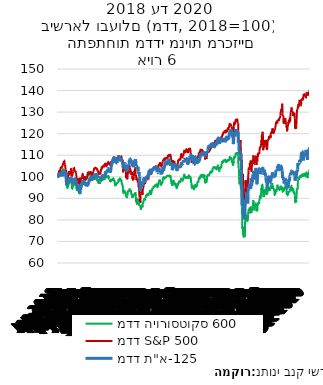
| Category | מדד היורוסטוקס 600  | מדד S&P 500 | מדד ת"א-125 |
|---|---|---|---|
| 2018-01-01 | 100 | 100 | 100 |
| 2018-01-02 | 99.787 | 100.83 | 100.552 |
| 2018-01-03 | 100.267 | 101.476 | 100.318 |
| 2018-01-04 | 101.156 | 101.884 | 101.053 |
| 2018-01-05 | 102.099 | 102.601 | 101.053 |
| 2018-01-06 | 102.099 | 102.601 | 101.053 |
| 2018-01-07 | 102.099 | 102.601 | 101.323 |
| 2018-01-08 | 102.372 | 102.772 | 100.929 |
| 2018-01-09 | 102.808 | 102.905 | 101.043 |
| 2018-01-10 | 102.42 | 102.791 | 100.127 |
| 2018-01-11 | 102.074 | 103.514 | 101.027 |
| 2018-01-12 | 102.392 | 104.213 | 101.027 |
| 2018-01-13 | 102.392 | 104.213 | 101.027 |
| 2018-01-14 | 102.392 | 104.213 | 101.786 |
| 2018-01-15 | 102.223 | 104.213 | 101.519 |
| 2018-01-16 | 102.356 | 103.845 | 101.572 |
| 2018-01-17 | 102.259 | 104.823 | 101.063 |
| 2018-01-18 | 102.454 | 104.654 | 100.897 |
| 2018-01-19 | 103.006 | 105.113 | 100.897 |
| 2018-01-20 | 103.006 | 105.113 | 100.897 |
| 2018-01-21 | 103.006 | 105.113 | 100.708 |
| 2018-01-22 | 103.322 | 105.96 | 101.179 |
| 2018-01-23 | 103.502 | 106.191 | 101.41 |
| 2018-01-24 | 102.983 | 106.131 | 101.652 |
| 2018-01-25 | 102.41 | 106.195 | 101.86 |
| 2018-01-26 | 102.927 | 107.453 | 101.86 |
| 2018-01-27 | 102.927 | 107.453 | 101.86 |
| 2018-01-28 | 102.927 | 107.453 | 102.695 |
| 2018-01-29 | 102.729 | 106.729 | 102.328 |
| 2018-01-30 | 101.783 | 105.566 | 101.649 |
| 2018-01-31 | 101.614 | 105.618 | 102.193 |
| 2018-02-01 | 101.107 | 105.549 | 101.828 |
| 2018-02-02 | 99.715 | 103.311 | 101.828 |
| 2018-02-03 | 99.715 | 103.311 | 101.828 |
| 2018-02-04 | 99.715 | 103.311 | 99.882 |
| 2018-02-05 | 98.155 | 99.077 | 99.173 |
| 2018-02-06 | 95.789 | 100.805 | 97.488 |
| 2018-02-07 | 97.675 | 100.301 | 98.548 |
| 2018-02-08 | 96.107 | 96.536 | 97.358 |
| 2018-02-09 | 94.715 | 97.978 | 97.358 |
| 2018-02-10 | 94.715 | 97.978 | 97.358 |
| 2018-02-11 | 94.715 | 97.978 | 96.201 |
| 2018-02-12 | 95.825 | 99.341 | 96.636 |
| 2018-02-13 | 95.221 | 99.601 | 96.644 |
| 2018-02-14 | 96.236 | 100.936 | 97.28 |
| 2018-02-15 | 96.744 | 102.154 | 98.304 |
| 2018-02-16 | 97.801 | 102.192 | 98.304 |
| 2018-02-17 | 97.801 | 102.192 | 98.304 |
| 2018-02-18 | 97.801 | 102.192 | 98.906 |
| 2018-02-19 | 97.189 | 102.192 | 99.634 |
| 2018-02-20 | 97.772 | 101.595 | 98.971 |
| 2018-02-21 | 97.924 | 101.037 | 99.167 |
| 2018-02-22 | 97.729 | 101.135 | 98.827 |
| 2018-02-23 | 97.939 | 102.756 | 98.827 |
| 2018-02-24 | 97.939 | 102.756 | 98.827 |
| 2018-02-25 | 97.939 | 102.756 | 99.329 |
| 2018-02-26 | 98.427 | 103.964 | 99.325 |
| 2018-02-27 | 98.248 | 102.643 | 99.488 |
| 2018-02-28 | 97.546 | 101.504 | 98.82 |
| 2018-03-01 | 96.32 | 100.152 | 98.82 |
| 2018-03-02 | 94.311 | 100.66 | 98.82 |
| 2018-03-03 | 94.311 | 100.66 | 98.82 |
| 2018-03-04 | 94.311 | 100.66 | 97.844 |
| 2018-03-05 | 95.295 | 101.77 | 97.171 |
| 2018-03-06 | 95.424 | 102.039 | 97.577 |
| 2018-03-07 | 95.768 | 101.989 | 97.383 |
| 2018-03-08 | 96.773 | 102.445 | 97.42 |
| 2018-03-09 | 97.189 | 104.225 | 97.42 |
| 2018-03-10 | 97.189 | 104.225 | 97.42 |
| 2018-03-11 | 97.189 | 104.225 | 98.238 |
| 2018-03-12 | 97.436 | 104.092 | 98.115 |
| 2018-03-13 | 96.482 | 103.43 | 98.81 |
| 2018-03-14 | 96.341 | 102.838 | 98.608 |
| 2018-03-15 | 96.84 | 102.757 | 99.06 |
| 2018-03-16 | 97.053 | 102.932 | 99.06 |
| 2018-03-17 | 97.053 | 102.932 | 99.06 |
| 2018-03-18 | 97.053 | 102.932 | 98.783 |
| 2018-03-19 | 96.017 | 101.47 | 97.777 |
| 2018-03-20 | 96.503 | 101.621 | 98.052 |
| 2018-03-21 | 96.346 | 101.433 | 97.885 |
| 2018-03-22 | 94.853 | 98.881 | 96.868 |
| 2018-03-23 | 93.998 | 96.808 | 96.868 |
| 2018-03-24 | 93.998 | 96.808 | 96.868 |
| 2018-03-25 | 93.998 | 96.808 | 94.162 |
| 2018-03-26 | 93.319 | 99.437 | 95.058 |
| 2018-03-27 | 94.447 | 97.719 | 95.924 |
| 2018-03-28 | 94.882 | 97.434 | 94.925 |
| 2018-03-29 | 95.295 | 98.775 | 95.083 |
| 2018-03-30 | 95.295 | 98.775 | 95.083 |
| 2018-03-31 | 95.295 | 98.775 | 95.083 |
| 2018-04-01 | 95.295 | 98.775 | 95.488 |
| 2018-04-02 | 95.295 | 96.569 | 94.909 |
| 2018-04-03 | 94.833 | 97.787 | 94.241 |
| 2018-04-04 | 94.386 | 98.918 | 92.098 |
| 2018-04-05 | 96.647 | 99.597 | 92.098 |
| 2018-04-06 | 96.31 | 97.414 | 92.098 |
| 2018-04-07 | 96.31 | 97.414 | 92.098 |
| 2018-04-08 | 96.31 | 97.414 | 93.612 |
| 2018-04-09 | 96.434 | 97.739 | 93.867 |
| 2018-04-10 | 97.235 | 99.374 | 95.276 |
| 2018-04-11 | 96.66 | 98.825 | 94.967 |
| 2018-04-12 | 97.338 | 99.64 | 96.301 |
| 2018-04-13 | 97.436 | 99.353 | 96.301 |
| 2018-04-14 | 97.436 | 99.353 | 96.301 |
| 2018-04-15 | 97.436 | 99.353 | 96.838 |
| 2018-04-16 | 97.06 | 100.158 | 97.307 |
| 2018-04-17 | 97.839 | 101.226 | 97.687 |
| 2018-04-18 | 98.119 | 101.31 | 97.687 |
| 2018-04-19 | 98.142 | 100.73 | 97.687 |
| 2018-04-20 | 98.114 | 99.87 | 97.687 |
| 2018-04-21 | 98.114 | 99.87 | 97.687 |
| 2018-04-22 | 98.114 | 99.87 | 98.048 |
| 2018-04-23 | 98.458 | 99.876 | 97.544 |
| 2018-04-24 | 98.44 | 98.539 | 97.475 |
| 2018-04-25 | 97.685 | 98.72 | 96.197 |
| 2018-04-26 | 98.605 | 99.751 | 96.601 |
| 2018-04-27 | 98.833 | 99.862 | 96.601 |
| 2018-04-28 | 98.833 | 99.862 | 96.601 |
| 2018-04-29 | 98.833 | 99.862 | 97.054 |
| 2018-04-30 | 99.008 | 99.044 | 96.35 |
| 2018-05-01 | 98.934 | 99.296 | 96.152 |
| 2018-05-02 | 99.553 | 98.581 | 96.768 |
| 2018-05-03 | 98.828 | 98.359 | 96.361 |
| 2018-05-04 | 99.448 | 99.619 | 96.361 |
| 2018-05-05 | 99.448 | 99.619 | 96.361 |
| 2018-05-06 | 99.448 | 99.619 | 96.958 |
| 2018-05-07 | 100.085 | 99.963 | 96.813 |
| 2018-05-08 | 100.211 | 99.937 | 96 |
| 2018-05-09 | 100.838 | 100.904 | 96.287 |
| 2018-05-10 | 100.717 | 101.85 | 96.445 |
| 2018-05-11 | 100.827 | 102.024 | 96.445 |
| 2018-05-12 | 100.827 | 102.024 | 96.445 |
| 2018-05-13 | 100.827 | 102.024 | 97.277 |
| 2018-05-14 | 100.773 | 102.114 | 97.315 |
| 2018-05-15 | 100.82 | 101.415 | 97.586 |
| 2018-05-16 | 101.036 | 101.827 | 98.148 |
| 2018-05-17 | 101.698 | 101.74 | 98.886 |
| 2018-05-18 | 101.411 | 101.472 | 98.886 |
| 2018-05-19 | 101.411 | 101.472 | 98.886 |
| 2018-05-20 | 101.411 | 101.472 | 98.886 |
| 2018-05-21 | 101.719 | 102.222 | 99.647 |
| 2018-05-22 | 101.994 | 101.901 | 99.274 |
| 2018-05-23 | 100.874 | 102.232 | 98.617 |
| 2018-05-24 | 100.349 | 102.025 | 98.872 |
| 2018-05-25 | 100.488 | 101.785 | 98.872 |
| 2018-05-26 | 100.488 | 101.785 | 98.872 |
| 2018-05-27 | 100.488 | 101.785 | 99.581 |
| 2018-05-28 | 100.164 | 101.785 | 99.409 |
| 2018-05-29 | 98.79 | 100.608 | 98.714 |
| 2018-05-30 | 99.052 | 101.885 | 98.989 |
| 2018-05-31 | 98.427 | 101.184 | 99.042 |
| 2018-06-01 | 99.417 | 102.282 | 99.042 |
| 2018-06-02 | 99.417 | 102.282 | 99.042 |
| 2018-06-03 | 99.417 | 102.282 | 99.51 |
| 2018-06-04 | 99.725 | 102.74 | 99.899 |
| 2018-06-05 | 99.412 | 102.812 | 100.496 |
| 2018-06-06 | 99.409 | 103.693 | 100.274 |
| 2018-06-07 | 99.167 | 103.619 | 100.718 |
| 2018-06-08 | 98.957 | 103.943 | 100.718 |
| 2018-06-09 | 98.957 | 103.943 | 100.718 |
| 2018-06-10 | 98.957 | 103.943 | 100.656 |
| 2018-06-11 | 99.681 | 104.054 | 101.03 |
| 2018-06-12 | 99.576 | 104.235 | 100.951 |
| 2018-06-13 | 99.761 | 103.816 | 101.043 |
| 2018-06-14 | 100.992 | 104.072 | 101.058 |
| 2018-06-15 | 99.987 | 103.967 | 101.058 |
| 2018-06-16 | 99.987 | 103.967 | 101.058 |
| 2018-06-17 | 99.987 | 103.967 | 101.009 |
| 2018-06-18 | 99.16 | 103.745 | 100.384 |
| 2018-06-19 | 98.466 | 103.328 | 99.843 |
| 2018-06-20 | 98.744 | 103.505 | 100.583 |
| 2018-06-21 | 97.86 | 102.848 | 99.953 |
| 2018-06-22 | 98.929 | 103.04 | 99.953 |
| 2018-06-23 | 98.929 | 103.04 | 99.953 |
| 2018-06-24 | 98.929 | 103.04 | 100.413 |
| 2018-06-25 | 96.883 | 101.626 | 99.499 |
| 2018-06-26 | 96.935 | 101.85 | 99.586 |
| 2018-06-27 | 97.633 | 100.973 | 99.596 |
| 2018-06-28 | 96.837 | 101.597 | 98.865 |
| 2018-06-29 | 97.623 | 101.674 | 98.865 |
| 2018-06-30 | 97.623 | 101.674 | 98.865 |
| 2018-07-01 | 97.623 | 101.674 | 99.136 |
| 2018-07-02 | 96.806 | 101.986 | 98.777 |
| 2018-07-03 | 97.592 | 101.482 | 99.3 |
| 2018-07-04 | 97.654 | 101.482 | 99.134 |
| 2018-07-05 | 98.05 | 102.356 | 98.933 |
| 2018-07-06 | 98.248 | 103.224 | 98.933 |
| 2018-07-07 | 98.248 | 103.224 | 98.933 |
| 2018-07-08 | 98.248 | 103.224 | 99.407 |
| 2018-07-09 | 98.821 | 104.135 | 99.591 |
| 2018-07-10 | 99.247 | 104.497 | 100.175 |
| 2018-07-11 | 98.001 | 103.756 | 99.899 |
| 2018-07-12 | 98.764 | 104.663 | 100.493 |
| 2018-07-13 | 98.934 | 104.776 | 100.493 |
| 2018-07-14 | 98.934 | 104.776 | 100.493 |
| 2018-07-15 | 98.934 | 104.776 | 100.527 |
| 2018-07-16 | 98.682 | 104.669 | 100.341 |
| 2018-07-17 | 98.921 | 105.085 | 100.353 |
| 2018-07-18 | 99.455 | 105.312 | 100.478 |
| 2018-07-19 | 99.229 | 104.895 | 100.287 |
| 2018-07-20 | 99.085 | 104.796 | 100.287 |
| 2018-07-21 | 99.085 | 104.796 | 100.287 |
| 2018-07-22 | 99.085 | 104.796 | 100.287 |
| 2018-07-23 | 98.895 | 104.988 | 100.311 |
| 2018-07-24 | 99.743 | 105.49 | 101.243 |
| 2018-07-25 | 99.484 | 106.45 | 101.72 |
| 2018-07-26 | 100.347 | 106.128 | 102.119 |
| 2018-07-27 | 100.745 | 105.431 | 102.119 |
| 2018-07-28 | 100.745 | 105.431 | 102.119 |
| 2018-07-29 | 100.745 | 105.431 | 101.762 |
| 2018-07-30 | 100.447 | 104.825 | 102.088 |
| 2018-07-31 | 100.624 | 105.337 | 102.156 |
| 2018-08-01 | 100.17 | 105.227 | 102.557 |
| 2018-08-02 | 99.347 | 105.745 | 102.112 |
| 2018-08-03 | 99.995 | 106.237 | 102.112 |
| 2018-08-04 | 99.995 | 106.237 | 102.112 |
| 2018-08-05 | 99.995 | 106.237 | 103.698 |
| 2018-08-06 | 99.866 | 106.612 | 103.718 |
| 2018-08-07 | 100.337 | 106.913 | 103.843 |
| 2018-08-08 | 100.131 | 106.885 | 103.537 |
| 2018-08-09 | 100.224 | 106.731 | 103.108 |
| 2018-08-10 | 99.147 | 105.972 | 103.108 |
| 2018-08-11 | 99.147 | 105.972 | 103.108 |
| 2018-08-12 | 99.147 | 105.972 | 102.968 |
| 2018-08-13 | 98.903 | 105.548 | 102.555 |
| 2018-08-14 | 98.905 | 106.222 | 102.428 |
| 2018-08-15 | 97.564 | 105.414 | 101.84 |
| 2018-08-16 | 98.009 | 106.249 | 102.891 |
| 2018-08-17 | 97.914 | 106.602 | 102.891 |
| 2018-08-18 | 97.914 | 106.602 | 102.891 |
| 2018-08-19 | 97.914 | 106.602 | 103.621 |
| 2018-08-20 | 98.471 | 106.861 | 104.852 |
| 2018-08-21 | 98.708 | 107.082 | 105.364 |
| 2018-08-22 | 98.674 | 107.04 | 105.5 |
| 2018-08-23 | 98.51 | 106.859 | 106.563 |
| 2018-08-24 | 98.556 | 107.521 | 106.563 |
| 2018-08-25 | 98.556 | 107.521 | 106.563 |
| 2018-08-26 | 98.556 | 107.521 | 106.961 |
| 2018-08-27 | 99.072 | 108.346 | 107.819 |
| 2018-08-28 | 99.044 | 108.375 | 107.607 |
| 2018-08-29 | 99.332 | 108.993 | 108.053 |
| 2018-08-30 | 99.018 | 108.51 | 108.324 |
| 2018-08-31 | 98.222 | 108.524 | 108.324 |
| 2018-09-01 | 98.222 | 108.524 | 108.324 |
| 2018-09-02 | 98.222 | 108.524 | 108.908 |
| 2018-09-03 | 98.286 | 108.524 | 108.67 |
| 2018-09-04 | 97.598 | 108.345 | 107.838 |
| 2018-09-05 | 96.531 | 108.041 | 106.463 |
| 2018-09-06 | 95.963 | 107.647 | 106.701 |
| 2018-09-07 | 96.04 | 107.408 | 106.701 |
| 2018-09-08 | 96.04 | 107.408 | 106.701 |
| 2018-09-09 | 96.04 | 107.408 | 106.701 |
| 2018-09-10 | 96.487 | 107.612 | 106.701 |
| 2018-09-11 | 96.436 | 108.015 | 106.701 |
| 2018-09-12 | 96.891 | 108.053 | 106.562 |
| 2018-09-13 | 96.747 | 108.624 | 106.352 |
| 2018-09-14 | 97.089 | 108.654 | 106.352 |
| 2018-09-15 | 97.089 | 108.654 | 106.352 |
| 2018-09-16 | 97.089 | 108.654 | 107.848 |
| 2018-09-17 | 97.207 | 108.049 | 108.393 |
| 2018-09-18 | 97.315 | 108.629 | 108.393 |
| 2018-09-19 | 97.636 | 108.765 | 108.393 |
| 2018-09-20 | 98.317 | 109.618 | 109.199 |
| 2018-09-21 | 98.744 | 109.577 | 109.199 |
| 2018-09-22 | 98.744 | 109.577 | 109.199 |
| 2018-09-23 | 98.744 | 109.577 | 109.199 |
| 2018-09-24 | 98.191 | 109.192 | 109.199 |
| 2018-09-25 | 98.641 | 109.05 | 109.113 |
| 2018-09-26 | 98.936 | 108.691 | 108.337 |
| 2018-09-27 | 99.281 | 108.991 | 107.732 |
| 2018-09-28 | 98.458 | 108.99 | 107.732 |
| 2018-09-29 | 98.458 | 108.99 | 107.732 |
| 2018-09-30 | 98.458 | 108.99 | 107.732 |
| 2018-10-01 | 98.654 | 109.387 | 107.732 |
| 2018-10-02 | 98.14 | 109.344 | 108.239 |
| 2018-10-03 | 98.628 | 109.422 | 108.797 |
| 2018-10-04 | 97.559 | 108.528 | 107.401 |
| 2018-10-05 | 96.719 | 107.928 | 107.401 |
| 2018-10-06 | 96.719 | 107.928 | 107.401 |
| 2018-10-07 | 96.719 | 107.928 | 107.03 |
| 2018-10-08 | 95.64 | 107.885 | 106.533 |
| 2018-10-09 | 95.825 | 107.732 | 106.667 |
| 2018-10-10 | 94.283 | 104.192 | 105.244 |
| 2018-10-11 | 92.412 | 102.048 | 104.135 |
| 2018-10-12 | 92.232 | 103.498 | 104.135 |
| 2018-10-13 | 92.232 | 103.498 | 104.135 |
| 2018-10-14 | 92.232 | 103.498 | 104.715 |
| 2018-10-15 | 92.325 | 102.887 | 104.3 |
| 2018-10-16 | 93.784 | 105.098 | 105.667 |
| 2018-10-17 | 93.412 | 105.072 | 105.599 |
| 2018-10-18 | 92.931 | 103.56 | 106.143 |
| 2018-10-19 | 92.821 | 103.522 | 106.143 |
| 2018-10-20 | 92.821 | 103.522 | 106.143 |
| 2018-10-21 | 92.821 | 103.522 | 105.497 |
| 2018-10-22 | 92.435 | 103.077 | 105.543 |
| 2018-10-23 | 90.976 | 102.509 | 103.657 |
| 2018-10-24 | 90.773 | 99.345 | 104.254 |
| 2018-10-25 | 91.235 | 101.195 | 102.881 |
| 2018-10-26 | 90.534 | 99.442 | 102.881 |
| 2018-10-27 | 90.534 | 99.442 | 102.881 |
| 2018-10-28 | 90.534 | 99.442 | 103.062 |
| 2018-10-29 | 91.348 | 98.79 | 103.232 |
| 2018-10-30 | 91.354 | 100.337 | 103.232 |
| 2018-10-31 | 92.916 | 101.426 | 104.26 |
| 2018-11-01 | 93.294 | 102.497 | 105.802 |
| 2018-11-02 | 93.551 | 101.85 | 105.802 |
| 2018-11-03 | 93.551 | 101.85 | 105.802 |
| 2018-11-04 | 93.551 | 101.85 | 105.686 |
| 2018-11-05 | 93.402 | 102.42 | 105.593 |
| 2018-11-06 | 93.157 | 103.061 | 106.238 |
| 2018-11-07 | 94.144 | 105.247 | 107.973 |
| 2018-11-08 | 94.321 | 104.983 | 108.353 |
| 2018-11-09 | 93.977 | 104.017 | 108.353 |
| 2018-11-10 | 93.977 | 104.017 | 108.353 |
| 2018-11-11 | 93.977 | 104.017 | 108.085 |
| 2018-11-12 | 93.024 | 101.968 | 107.433 |
| 2018-11-13 | 93.643 | 101.817 | 107.688 |
| 2018-11-14 | 93.085 | 101.046 | 106.985 |
| 2018-11-15 | 92.099 | 102.117 | 106.804 |
| 2018-11-16 | 91.914 | 102.344 | 106.804 |
| 2018-11-17 | 91.914 | 102.344 | 106.804 |
| 2018-11-18 | 91.914 | 102.344 | 107.134 |
| 2018-11-19 | 91.246 | 100.64 | 106.911 |
| 2018-11-20 | 90.205 | 98.814 | 105.173 |
| 2018-11-21 | 91.235 | 99.114 | 105.697 |
| 2018-11-22 | 90.593 | 99.114 | 105.011 |
| 2018-11-23 | 90.955 | 98.465 | 105.011 |
| 2018-11-24 | 90.955 | 98.465 | 105.011 |
| 2018-11-25 | 90.955 | 98.465 | 104.472 |
| 2018-11-26 | 92.073 | 99.994 | 105.852 |
| 2018-11-27 | 91.834 | 100.32 | 105.996 |
| 2018-11-28 | 91.832 | 102.625 | 106.828 |
| 2018-11-29 | 92.014 | 102.399 | 106.553 |
| 2018-11-30 | 91.857 | 103.238 | 106.553 |
| 2018-12-01 | 91.857 | 103.238 | 106.553 |
| 2018-12-02 | 91.857 | 103.238 | 108.067 |
| 2018-12-03 | 92.805 | 104.367 | 108.186 |
| 2018-12-04 | 92.099 | 100.989 | 106.817 |
| 2018-12-05 | 91.03 | 100.989 | 107.423 |
| 2018-12-06 | 88.214 | 100.836 | 104.776 |
| 2018-12-07 | 88.764 | 98.484 | 104.776 |
| 2018-12-08 | 88.764 | 98.484 | 104.776 |
| 2018-12-09 | 88.764 | 98.484 | 104.543 |
| 2018-12-10 | 87.104 | 98.658 | 103.79 |
| 2018-12-11 | 88.437 | 98.622 | 104.498 |
| 2018-12-12 | 89.933 | 99.157 | 104.482 |
| 2018-12-13 | 89.784 | 99.137 | 104.604 |
| 2018-12-14 | 89.216 | 97.245 | 104.604 |
| 2018-12-15 | 89.216 | 97.245 | 104.604 |
| 2018-12-16 | 89.216 | 97.245 | 102.716 |
| 2018-12-17 | 88.201 | 95.225 | 102.433 |
| 2018-12-18 | 87.481 | 95.233 | 101.487 |
| 2018-12-19 | 87.754 | 93.767 | 102.153 |
| 2018-12-20 | 86.484 | 92.288 | 100.127 |
| 2018-12-21 | 86.508 | 90.388 | 100.127 |
| 2018-12-22 | 86.508 | 90.388 | 100.127 |
| 2018-12-23 | 86.508 | 90.388 | 95.397 |
| 2018-12-24 | 86.14 | 87.937 | 93.424 |
| 2018-12-25 | 86.14 | 87.937 | 95.202 |
| 2018-12-26 | 86.14 | 92.298 | 95.491 |
| 2018-12-27 | 84.686 | 93.089 | 95.346 |
| 2018-12-28 | 86.394 | 92.973 | 95.346 |
| 2018-12-29 | 86.394 | 92.973 | 95.346 |
| 2018-12-30 | 86.394 | 92.973 | 96.596 |
| 2018-12-31 | 86.759 | 93.763 | 96.73 |
| 2019-01-01 | 86.759 | 93.763 | 97.87 |
| 2019-01-02 | 86.646 | 93.882 | 96.804 |
| 2019-01-03 | 85.801 | 91.557 | 95.785 |
| 2019-01-04 | 88.232 | 94.701 | 95.785 |
| 2019-01-05 | 88.232 | 94.701 | 95.785 |
| 2019-01-06 | 88.232 | 94.701 | 97.728 |
| 2019-01-07 | 88.103 | 95.365 | 98.183 |
| 2019-01-08 | 88.866 | 96.29 | 98.98 |
| 2019-01-09 | 89.342 | 96.684 | 99.188 |
| 2019-01-10 | 89.645 | 97.121 | 98.698 |
| 2019-01-11 | 89.727 | 97.107 | 98.698 |
| 2019-01-12 | 89.727 | 97.107 | 98.698 |
| 2019-01-13 | 89.727 | 97.107 | 98.269 |
| 2019-01-14 | 89.293 | 96.596 | 97.808 |
| 2019-01-15 | 89.601 | 97.632 | 98.494 |
| 2019-01-16 | 90.084 | 97.849 | 99.304 |
| 2019-01-17 | 90.12 | 98.592 | 99.294 |
| 2019-01-18 | 91.744 | 99.892 | 99.294 |
| 2019-01-19 | 91.744 | 99.892 | 99.294 |
| 2019-01-20 | 91.744 | 99.892 | 100.255 |
| 2019-01-21 | 91.567 | 99.892 | 99.686 |
| 2019-01-22 | 91.241 | 98.477 | 99.382 |
| 2019-01-23 | 91.189 | 98.694 | 99.815 |
| 2019-01-24 | 91.39 | 98.83 | 100.258 |
| 2019-01-25 | 91.947 | 99.669 | 100.258 |
| 2019-01-26 | 91.947 | 99.669 | 100.258 |
| 2019-01-27 | 91.947 | 99.669 | 100.747 |
| 2019-01-28 | 91.058 | 98.887 | 100.927 |
| 2019-01-29 | 91.79 | 98.743 | 101.22 |
| 2019-01-30 | 92.119 | 100.278 | 101.82 |
| 2019-01-31 | 92.16 | 101.14 | 102.533 |
| 2019-02-01 | 92.428 | 101.231 | 102.533 |
| 2019-02-02 | 92.428 | 101.231 | 102.533 |
| 2019-02-03 | 92.428 | 101.231 | 102.688 |
| 2019-02-04 | 92.482 | 101.917 | 102.627 |
| 2019-02-05 | 93.784 | 102.397 | 103.196 |
| 2019-02-06 | 93.921 | 102.169 | 102.66 |
| 2019-02-07 | 92.523 | 101.213 | 101.676 |
| 2019-02-08 | 92.006 | 101.282 | 101.676 |
| 2019-02-09 | 92.006 | 101.282 | 101.676 |
| 2019-02-10 | 92.006 | 101.282 | 101.66 |
| 2019-02-11 | 92.79 | 101.354 | 102.032 |
| 2019-02-12 | 93.217 | 102.66 | 102.535 |
| 2019-02-13 | 93.779 | 102.971 | 103.088 |
| 2019-02-14 | 93.479 | 102.697 | 102.955 |
| 2019-02-15 | 94.799 | 103.815 | 102.955 |
| 2019-02-16 | 94.799 | 103.815 | 102.955 |
| 2019-02-17 | 94.799 | 103.815 | 103.607 |
| 2019-02-18 | 95.015 | 103.815 | 103.676 |
| 2019-02-19 | 94.807 | 103.97 | 103.52 |
| 2019-02-20 | 95.447 | 104.155 | 104.215 |
| 2019-02-21 | 95.177 | 103.788 | 103.662 |
| 2019-02-22 | 95.388 | 104.453 | 103.662 |
| 2019-02-23 | 95.388 | 104.453 | 103.662 |
| 2019-02-24 | 95.388 | 104.453 | 104.051 |
| 2019-02-25 | 95.632 | 104.582 | 104.879 |
| 2019-02-26 | 96.007 | 104.499 | 104.486 |
| 2019-02-27 | 95.735 | 104.442 | 103.407 |
| 2019-02-28 | 95.791 | 104.147 | 103.85 |
| 2019-03-01 | 96.161 | 104.865 | 103.85 |
| 2019-03-02 | 96.161 | 104.865 | 103.85 |
| 2019-03-03 | 96.161 | 104.865 | 104.386 |
| 2019-03-04 | 96.38 | 104.458 | 104.811 |
| 2019-03-05 | 96.521 | 104.34 | 103.911 |
| 2019-03-06 | 96.48 | 103.659 | 103.671 |
| 2019-03-07 | 96.069 | 102.817 | 102.173 |
| 2019-03-08 | 95.218 | 102.598 | 102.173 |
| 2019-03-09 | 95.218 | 102.598 | 102.173 |
| 2019-03-10 | 95.218 | 102.598 | 101.881 |
| 2019-03-11 | 95.963 | 104.103 | 102.465 |
| 2019-03-12 | 95.907 | 104.41 | 102.111 |
| 2019-03-13 | 96.511 | 105.136 | 103.288 |
| 2019-03-14 | 97.261 | 105.044 | 102.902 |
| 2019-03-15 | 97.924 | 105.568 | 102.902 |
| 2019-03-16 | 97.924 | 105.568 | 102.902 |
| 2019-03-17 | 97.924 | 105.568 | 103.623 |
| 2019-03-18 | 98.183 | 105.959 | 103.395 |
| 2019-03-19 | 98.744 | 105.946 | 103.353 |
| 2019-03-20 | 97.857 | 105.634 | 102.962 |
| 2019-03-21 | 97.818 | 106.78 | 102.962 |
| 2019-03-22 | 96.621 | 104.754 | 102.962 |
| 2019-03-23 | 96.621 | 104.754 | 102.962 |
| 2019-03-24 | 96.621 | 104.754 | 101.679 |
| 2019-03-25 | 96.184 | 104.666 | 101.062 |
| 2019-03-26 | 96.922 | 105.418 | 102.497 |
| 2019-03-27 | 96.942 | 104.928 | 102.691 |
| 2019-03-28 | 96.829 | 105.305 | 101.897 |
| 2019-03-29 | 97.407 | 106.014 | 101.897 |
| 2019-03-30 | 97.407 | 106.014 | 101.897 |
| 2019-03-31 | 97.407 | 106.014 | 102.886 |
| 2019-04-01 | 98.584 | 107.24 | 103.787 |
| 2019-04-02 | 98.934 | 107.242 | 103.784 |
| 2019-04-03 | 99.933 | 107.473 | 104.097 |
| 2019-04-04 | 99.663 | 107.697 | 103.287 |
| 2019-04-05 | 99.756 | 108.196 | 103.287 |
| 2019-04-06 | 99.756 | 108.196 | 103.287 |
| 2019-04-07 | 99.756 | 108.196 | 104.067 |
| 2019-04-08 | 99.571 | 108.309 | 104.647 |
| 2019-04-09 | 99.101 | 107.652 | 104.647 |
| 2019-04-10 | 99.358 | 108.027 | 105.582 |
| 2019-04-11 | 99.417 | 108.031 | 106.074 |
| 2019-04-12 | 99.576 | 108.745 | 106.074 |
| 2019-04-13 | 99.576 | 108.745 | 106.074 |
| 2019-04-14 | 99.576 | 108.745 | 106.854 |
| 2019-04-15 | 99.722 | 108.676 | 106.786 |
| 2019-04-16 | 100.008 | 108.732 | 107.342 |
| 2019-04-17 | 100.105 | 108.484 | 106.605 |
| 2019-04-18 | 100.329 | 108.656 | 105.936 |
| 2019-04-19 | 100.329 | 108.656 | 105.936 |
| 2019-04-20 | 100.329 | 108.656 | 105.936 |
| 2019-04-21 | 100.329 | 108.656 | 106.53 |
| 2019-04-22 | 100.329 | 108.766 | 106.043 |
| 2019-04-23 | 100.558 | 109.727 | 106.661 |
| 2019-04-24 | 100.463 | 109.487 | 107.718 |
| 2019-04-25 | 100.249 | 109.446 | 107.718 |
| 2019-04-26 | 100.47 | 109.959 | 107.718 |
| 2019-04-27 | 100.47 | 109.959 | 107.718 |
| 2019-04-28 | 100.47 | 109.959 | 108.453 |
| 2019-04-29 | 100.55 | 110.077 | 107.905 |
| 2019-04-30 | 100.558 | 110.182 | 106.556 |
| 2019-05-01 | 100.491 | 109.355 | 106.386 |
| 2019-05-02 | 99.913 | 109.123 | 105.746 |
| 2019-05-03 | 100.306 | 110.175 | 105.746 |
| 2019-05-04 | 100.306 | 110.175 | 105.746 |
| 2019-05-05 | 100.306 | 110.175 | 106.036 |
| 2019-05-06 | 99.427 | 109.682 | 105.11 |
| 2019-05-07 | 98.063 | 107.871 | 105.901 |
| 2019-05-08 | 98.214 | 107.698 | 105.901 |
| 2019-05-09 | 96.593 | 107.372 | 105.901 |
| 2019-05-10 | 96.906 | 107.772 | 105.901 |
| 2019-05-11 | 96.906 | 107.772 | 105.901 |
| 2019-05-12 | 96.906 | 107.772 | 105.416 |
| 2019-05-13 | 95.732 | 105.171 | 103.033 |
| 2019-05-14 | 96.701 | 106.014 | 104.192 |
| 2019-05-15 | 97.143 | 106.633 | 103.798 |
| 2019-05-16 | 98.381 | 107.582 | 105.401 |
| 2019-05-17 | 98.029 | 106.954 | 105.401 |
| 2019-05-18 | 98.029 | 106.954 | 105.401 |
| 2019-05-19 | 98.029 | 106.954 | 105.476 |
| 2019-05-20 | 96.989 | 106.232 | 104.757 |
| 2019-05-21 | 97.513 | 107.135 | 105.483 |
| 2019-05-22 | 97.433 | 106.832 | 106.214 |
| 2019-05-23 | 96.046 | 105.559 | 105.069 |
| 2019-05-24 | 96.585 | 105.702 | 105.069 |
| 2019-05-25 | 96.585 | 105.702 | 105.069 |
| 2019-05-26 | 96.585 | 105.702 | 105.52 |
| 2019-05-27 | 96.796 | 105.702 | 105.153 |
| 2019-05-28 | 96.588 | 104.817 | 105.076 |
| 2019-05-29 | 95.203 | 104.092 | 103.742 |
| 2019-05-30 | 95.604 | 104.311 | 104.11 |
| 2019-05-31 | 94.83 | 102.934 | 104.11 |
| 2019-06-01 | 94.83 | 102.934 | 104.11 |
| 2019-06-02 | 94.83 | 102.934 | 102.715 |
| 2019-06-03 | 95.198 | 102.65 | 102.962 |
| 2019-06-04 | 95.758 | 104.85 | 103.84 |
| 2019-06-05 | 96.12 | 105.705 | 104.183 |
| 2019-06-06 | 96.102 | 106.354 | 103.816 |
| 2019-06-07 | 96.994 | 107.47 | 103.816 |
| 2019-06-08 | 96.994 | 107.47 | 103.816 |
| 2019-06-09 | 96.994 | 107.47 | 103.816 |
| 2019-06-10 | 97.197 | 107.971 | 105.174 |
| 2019-06-11 | 97.87 | 107.933 | 104.713 |
| 2019-06-12 | 97.574 | 107.714 | 104.074 |
| 2019-06-13 | 97.726 | 108.155 | 104.972 |
| 2019-06-14 | 97.335 | 107.981 | 104.972 |
| 2019-06-15 | 97.335 | 107.981 | 104.972 |
| 2019-06-16 | 97.335 | 107.981 | 104.773 |
| 2019-06-17 | 97.245 | 108.081 | 104.247 |
| 2019-06-18 | 98.869 | 109.131 | 105.183 |
| 2019-06-19 | 98.867 | 109.457 | 105.484 |
| 2019-06-20 | 99.224 | 110.494 | 106.192 |
| 2019-06-21 | 98.864 | 110.355 | 106.192 |
| 2019-06-22 | 98.864 | 110.355 | 106.192 |
| 2019-06-23 | 98.864 | 110.355 | 106.249 |
| 2019-06-24 | 98.615 | 110.164 | 106.257 |
| 2019-06-25 | 98.515 | 109.118 | 105.794 |
| 2019-06-26 | 98.206 | 108.983 | 106.121 |
| 2019-06-27 | 98.209 | 109.4 | 106.494 |
| 2019-06-28 | 98.893 | 110.03 | 106.494 |
| 2019-06-29 | 98.893 | 110.03 | 106.494 |
| 2019-06-30 | 98.893 | 110.03 | 107.757 |
| 2019-07-01 | 99.663 | 110.874 | 107.652 |
| 2019-07-02 | 100.028 | 111.198 | 107.636 |
| 2019-07-03 | 100.874 | 112.051 | 107.93 |
| 2019-07-04 | 100.966 | 112.051 | 108.169 |
| 2019-07-05 | 100.239 | 111.849 | 108.169 |
| 2019-07-06 | 100.239 | 111.849 | 108.169 |
| 2019-07-07 | 100.239 | 111.849 | 107.942 |
| 2019-07-08 | 100.185 | 111.308 | 107.319 |
| 2019-07-09 | 99.676 | 111.446 | 107.73 |
| 2019-07-10 | 99.478 | 111.949 | 108.021 |
| 2019-07-11 | 99.363 | 112.204 | 107.988 |
| 2019-07-12 | 99.401 | 112.723 | 107.988 |
| 2019-07-13 | 99.401 | 112.723 | 107.988 |
| 2019-07-14 | 99.401 | 112.723 | 108.465 |
| 2019-07-15 | 99.633 | 112.743 | 108.191 |
| 2019-07-16 | 99.979 | 112.359 | 107.991 |
| 2019-07-17 | 99.609 | 111.625 | 106.92 |
| 2019-07-18 | 99.388 | 112.025 | 106.092 |
| 2019-07-19 | 99.504 | 111.333 | 106.092 |
| 2019-07-20 | 99.504 | 111.333 | 106.092 |
| 2019-07-21 | 99.504 | 111.333 | 106.225 |
| 2019-07-22 | 99.63 | 111.648 | 106.605 |
| 2019-07-23 | 100.606 | 112.412 | 107.633 |
| 2019-07-24 | 100.655 | 112.939 | 108.788 |
| 2019-07-25 | 100.087 | 112.345 | 108.721 |
| 2019-07-26 | 100.398 | 113.175 | 108.721 |
| 2019-07-27 | 100.398 | 113.175 | 108.721 |
| 2019-07-28 | 100.398 | 113.175 | 109.54 |
| 2019-07-29 | 100.429 | 112.992 | 109.135 |
| 2019-07-30 | 98.954 | 112.701 | 108.843 |
| 2019-07-31 | 99.124 | 111.474 | 109.815 |
| 2019-08-01 | 99.615 | 110.471 | 110.171 |
| 2019-08-02 | 97.166 | 109.666 | 110.171 |
| 2019-08-03 | 97.166 | 109.666 | 110.171 |
| 2019-08-04 | 97.166 | 109.666 | 109.966 |
| 2019-08-05 | 94.925 | 106.401 | 107.752 |
| 2019-08-06 | 94.483 | 107.786 | 108.235 |
| 2019-08-07 | 94.712 | 107.868 | 107.33 |
| 2019-08-08 | 96.282 | 109.892 | 109.388 |
| 2019-08-09 | 95.473 | 109.165 | 109.388 |
| 2019-08-10 | 95.473 | 109.165 | 109.388 |
| 2019-08-11 | 95.473 | 109.165 | 109.388 |
| 2019-08-12 | 95.177 | 107.86 | 108.828 |
| 2019-08-13 | 95.688 | 109.452 | 109.491 |
| 2019-08-14 | 94.085 | 106.246 | 106.74 |
| 2019-08-15 | 93.81 | 106.508 | 105.758 |
| 2019-08-16 | 94.977 | 108.044 | 105.758 |
| 2019-08-17 | 94.977 | 108.044 | 105.758 |
| 2019-08-18 | 94.977 | 108.044 | 106.143 |
| 2019-08-19 | 96.064 | 109.352 | 107.645 |
| 2019-08-20 | 95.406 | 108.487 | 108.125 |
| 2019-08-21 | 96.562 | 109.381 | 108.91 |
| 2019-08-22 | 96.174 | 109.326 | 109.278 |
| 2019-08-23 | 95.421 | 106.489 | 109.278 |
| 2019-08-24 | 95.421 | 106.489 | 109.278 |
| 2019-08-25 | 95.421 | 106.489 | 105.912 |
| 2019-08-26 | 95.401 | 107.659 | 106.763 |
| 2019-08-27 | 96.002 | 107.314 | 106.633 |
| 2019-08-28 | 95.807 | 108.017 | 105.979 |
| 2019-08-29 | 96.804 | 109.387 | 107.419 |
| 2019-08-30 | 97.508 | 109.457 | 107.419 |
| 2019-08-31 | 97.508 | 109.457 | 107.419 |
| 2019-09-01 | 97.508 | 109.457 | 107.404 |
| 2019-09-02 | 97.818 | 109.457 | 107.296 |
| 2019-09-03 | 97.592 | 108.702 | 106.55 |
| 2019-09-04 | 98.458 | 109.881 | 107.285 |
| 2019-09-05 | 99.162 | 111.31 | 107.467 |
| 2019-09-06 | 99.476 | 111.412 | 107.467 |
| 2019-09-07 | 99.476 | 111.412 | 107.467 |
| 2019-09-08 | 99.476 | 111.412 | 108.091 |
| 2019-09-09 | 99.198 | 111.401 | 108.258 |
| 2019-09-10 | 99.296 | 111.437 | 108.662 |
| 2019-09-11 | 100.136 | 112.243 | 109.749 |
| 2019-09-12 | 100.334 | 112.566 | 110.322 |
| 2019-09-13 | 100.671 | 112.484 | 110.322 |
| 2019-09-14 | 100.671 | 112.484 | 110.322 |
| 2019-09-15 | 100.671 | 112.484 | 110.045 |
| 2019-09-16 | 100.09 | 112.132 | 109.999 |
| 2019-09-17 | 100.039 | 112.421 | 109.999 |
| 2019-09-18 | 100.059 | 112.46 | 110.498 |
| 2019-09-19 | 100.673 | 112.462 | 110.87 |
| 2019-09-20 | 100.969 | 111.911 | 110.87 |
| 2019-09-21 | 100.969 | 111.911 | 110.87 |
| 2019-09-22 | 100.969 | 111.911 | 110.309 |
| 2019-09-23 | 100.159 | 111.9 | 110.236 |
| 2019-09-24 | 100.17 | 110.959 | 110.598 |
| 2019-09-25 | 99.591 | 111.642 | 110.32 |
| 2019-09-26 | 100.198 | 111.371 | 111.196 |
| 2019-09-27 | 100.671 | 110.779 | 111.196 |
| 2019-09-28 | 100.671 | 110.779 | 111.196 |
| 2019-09-29 | 100.671 | 110.779 | 111.196 |
| 2019-09-30 | 101.02 | 111.338 | 111.196 |
| 2019-10-01 | 99.694 | 109.973 | 111.196 |
| 2019-10-02 | 97.004 | 108.004 | 110.341 |
| 2019-10-03 | 96.989 | 108.865 | 109.466 |
| 2019-10-04 | 97.698 | 110.413 | 109.466 |
| 2019-10-05 | 97.698 | 110.413 | 109.466 |
| 2019-10-06 | 97.698 | 110.413 | 111.063 |
| 2019-10-07 | 98.389 | 109.918 | 111.2 |
| 2019-10-08 | 97.31 | 108.208 | 111.2 |
| 2019-10-09 | 97.718 | 109.193 | 111.2 |
| 2019-10-10 | 98.35 | 109.894 | 111.386 |
| 2019-10-11 | 100.624 | 111.096 | 111.386 |
| 2019-10-12 | 100.624 | 111.096 | 111.386 |
| 2019-10-13 | 100.624 | 111.096 | 111.386 |
| 2019-10-14 | 100.131 | 110.942 | 111.386 |
| 2019-10-15 | 101.244 | 112.046 | 112.646 |
| 2019-10-16 | 101.1 | 111.822 | 113.86 |
| 2019-10-17 | 101.002 | 112.131 | 113.964 |
| 2019-10-18 | 100.683 | 111.692 | 113.964 |
| 2019-10-19 | 100.683 | 111.692 | 113.964 |
| 2019-10-20 | 100.683 | 111.692 | 113.964 |
| 2019-10-21 | 101.295 | 112.459 | 113.964 |
| 2019-10-22 | 101.39 | 112.058 | 114.418 |
| 2019-10-23 | 101.503 | 112.377 | 113.937 |
| 2019-10-24 | 102.104 | 112.593 | 114.14 |
| 2019-10-25 | 102.269 | 113.051 | 114.14 |
| 2019-10-26 | 102.269 | 113.051 | 114.14 |
| 2019-10-27 | 102.269 | 113.051 | 114.708 |
| 2019-10-28 | 102.521 | 113.682 | 115.124 |
| 2019-10-29 | 102.361 | 113.588 | 114.956 |
| 2019-10-30 | 102.446 | 113.957 | 114.437 |
| 2019-10-31 | 101.945 | 113.613 | 114.491 |
| 2019-11-01 | 102.634 | 114.71 | 114.491 |
| 2019-11-02 | 102.634 | 114.71 | 114.491 |
| 2019-11-03 | 102.634 | 114.71 | 115.43 |
| 2019-11-04 | 103.656 | 115.135 | 115.39 |
| 2019-11-05 | 103.867 | 114.999 | 115.43 |
| 2019-11-06 | 104.083 | 115.08 | 114.904 |
| 2019-11-07 | 104.466 | 115.394 | 115.021 |
| 2019-11-08 | 104.173 | 115.689 | 115.021 |
| 2019-11-09 | 104.173 | 115.689 | 115.021 |
| 2019-11-10 | 104.173 | 115.689 | 114.817 |
| 2019-11-11 | 104.152 | 115.462 | 113.997 |
| 2019-11-12 | 104.553 | 115.643 | 113.849 |
| 2019-11-13 | 104.286 | 115.725 | 113.981 |
| 2019-11-14 | 103.913 | 115.822 | 114.564 |
| 2019-11-15 | 104.332 | 116.713 | 114.564 |
| 2019-11-16 | 104.332 | 116.713 | 114.564 |
| 2019-11-17 | 104.332 | 116.713 | 115.527 |
| 2019-11-18 | 104.319 | 116.772 | 115.285 |
| 2019-11-19 | 104.193 | 116.703 | 115.877 |
| 2019-11-20 | 103.762 | 116.265 | 115.576 |
| 2019-11-21 | 103.351 | 116.081 | 115.195 |
| 2019-11-22 | 103.803 | 116.333 | 115.195 |
| 2019-11-23 | 103.803 | 116.333 | 115.195 |
| 2019-11-24 | 103.803 | 116.333 | 115.518 |
| 2019-11-25 | 104.859 | 117.206 | 116.903 |
| 2019-11-26 | 104.962 | 117.464 | 117.318 |
| 2019-11-27 | 105.301 | 117.954 | 117.372 |
| 2019-11-28 | 105.157 | 117.954 | 117.939 |
| 2019-11-29 | 104.689 | 117.481 | 117.939 |
| 2019-11-30 | 104.689 | 117.481 | 117.939 |
| 2019-12-01 | 104.689 | 117.481 | 117.403 |
| 2019-12-02 | 103.04 | 116.467 | 116.601 |
| 2019-12-03 | 102.39 | 115.694 | 115.335 |
| 2019-12-04 | 103.6 | 116.425 | 116.14 |
| 2019-12-05 | 103.464 | 116.6 | 115.986 |
| 2019-12-06 | 104.669 | 117.665 | 115.986 |
| 2019-12-07 | 104.669 | 117.665 | 115.986 |
| 2019-12-08 | 104.669 | 117.665 | 117.051 |
| 2019-12-09 | 104.422 | 117.293 | 117.194 |
| 2019-12-10 | 104.152 | 117.164 | 117.261 |
| 2019-12-11 | 104.378 | 117.505 | 117.477 |
| 2019-12-12 | 104.728 | 118.513 | 117.589 |
| 2019-12-13 | 105.869 | 118.521 | 117.589 |
| 2019-12-14 | 105.869 | 118.521 | 117.589 |
| 2019-12-15 | 105.869 | 118.521 | 117.453 |
| 2019-12-16 | 107.341 | 119.369 | 117.653 |
| 2019-12-17 | 106.614 | 119.409 | 117.275 |
| 2019-12-18 | 106.475 | 119.357 | 117.253 |
| 2019-12-19 | 106.652 | 119.889 | 116.596 |
| 2019-12-20 | 107.508 | 120.482 | 116.596 |
| 2019-12-21 | 107.508 | 120.482 | 116.596 |
| 2019-12-22 | 107.508 | 120.482 | 117.031 |
| 2019-12-23 | 107.475 | 120.586 | 116.722 |
| 2019-12-24 | 107.626 | 120.563 | 117.359 |
| 2019-12-25 | 107.626 | 120.563 | 117.357 |
| 2019-12-26 | 107.626 | 121.181 | 117.127 |
| 2019-12-27 | 107.852 | 121.185 | 117.127 |
| 2019-12-28 | 107.852 | 121.185 | 117.127 |
| 2019-12-29 | 107.852 | 121.185 | 116.808 |
| 2019-12-30 | 106.935 | 120.485 | 116.478 |
| 2019-12-31 | 106.85 | 120.84 | 117.301 |
| 2020-01-01 | 106.85 | 120.84 | 117.81 |
| 2020-01-02 | 107.847 | 121.852 | 118.387 |
| 2020-01-03 | 107.49 | 120.992 | 118.387 |
| 2020-01-04 | 107.49 | 120.992 | 118.387 |
| 2020-01-05 | 107.49 | 120.992 | 117.875 |
| 2020-01-06 | 107.053 | 121.419 | 117.334 |
| 2020-01-07 | 107.321 | 121.079 | 117.286 |
| 2020-01-08 | 107.498 | 121.673 | 117.661 |
| 2020-01-09 | 107.827 | 122.482 | 117.806 |
| 2020-01-10 | 107.698 | 122.133 | 117.806 |
| 2020-01-11 | 107.698 | 122.133 | 117.806 |
| 2020-01-12 | 107.698 | 122.133 | 117.722 |
| 2020-01-13 | 107.506 | 122.985 | 117.812 |
| 2020-01-14 | 107.814 | 122.798 | 118.318 |
| 2020-01-15 | 107.824 | 123.028 | 119.412 |
| 2020-01-16 | 108.058 | 124.057 | 120.288 |
| 2020-01-17 | 109.091 | 124.536 | 120.288 |
| 2020-01-18 | 109.091 | 124.536 | 120.288 |
| 2020-01-19 | 109.091 | 124.536 | 120.856 |
| 2020-01-20 | 108.942 | 124.536 | 120.593 |
| 2020-01-21 | 108.788 | 124.206 | 120.731 |
| 2020-01-22 | 108.7 | 124.242 | 122.071 |
| 2020-01-23 | 107.927 | 124.384 | 121.862 |
| 2020-01-24 | 108.855 | 123.259 | 121.862 |
| 2020-01-25 | 108.855 | 123.259 | 121.862 |
| 2020-01-26 | 108.855 | 123.259 | 120.568 |
| 2020-01-27 | 106.395 | 121.32 | 118.658 |
| 2020-01-28 | 107.292 | 122.54 | 118.797 |
| 2020-01-29 | 107.768 | 122.434 | 119.229 |
| 2020-01-30 | 106.676 | 122.817 | 118.661 |
| 2020-01-31 | 105.532 | 120.643 | 118.661 |
| 2020-02-01 | 105.532 | 120.643 | 118.661 |
| 2020-02-02 | 105.532 | 120.643 | 115.145 |
| 2020-02-03 | 105.792 | 121.518 | 116.287 |
| 2020-02-04 | 107.526 | 123.338 | 118.279 |
| 2020-02-05 | 108.849 | 124.726 | 120.226 |
| 2020-02-06 | 109.33 | 125.141 | 120.81 |
| 2020-02-07 | 109.04 | 124.465 | 120.81 |
| 2020-02-08 | 109.04 | 124.465 | 120.81 |
| 2020-02-09 | 109.04 | 124.465 | 118.774 |
| 2020-02-10 | 109.111 | 125.377 | 119.288 |
| 2020-02-11 | 110.098 | 125.589 | 120.772 |
| 2020-02-12 | 110.787 | 126.4 | 122.193 |
| 2020-02-13 | 110.766 | 126.194 | 120.771 |
| 2020-02-14 | 110.622 | 126.427 | 120.771 |
| 2020-02-15 | 110.622 | 126.427 | 120.771 |
| 2020-02-16 | 110.622 | 126.427 | 121.092 |
| 2020-02-17 | 110.997 | 126.427 | 121.077 |
| 2020-02-18 | 110.574 | 126.058 | 120.167 |
| 2020-02-19 | 111.491 | 126.651 | 121.655 |
| 2020-02-20 | 110.538 | 126.168 | 120.948 |
| 2020-02-21 | 109.993 | 124.841 | 120.948 |
| 2020-02-22 | 109.993 | 124.841 | 120.948 |
| 2020-02-23 | 109.993 | 124.841 | 117.839 |
| 2020-02-24 | 105.828 | 120.657 | 115.876 |
| 2020-02-25 | 103.962 | 117.003 | 116.781 |
| 2020-02-26 | 103.967 | 116.561 | 116.749 |
| 2020-02-27 | 100.069 | 111.413 | 111.921 |
| 2020-02-28 | 96.523 | 110.496 | 111.921 |
| 2020-02-29 | 96.523 | 110.496 | 111.921 |
| 2020-03-01 | 96.523 | 110.496 | 110.439 |
| 2020-03-02 | 96.606 | 115.583 | 110.439 |
| 2020-03-03 | 97.932 | 112.334 | 111.869 |
| 2020-03-04 | 99.26 | 117.075 | 109.475 |
| 2020-03-05 | 97.836 | 113.103 | 107.377 |
| 2020-03-06 | 94.249 | 111.174 | 107.377 |
| 2020-03-07 | 94.249 | 111.174 | 107.377 |
| 2020-03-08 | 94.249 | 111.174 | 102.472 |
| 2020-03-09 | 87.235 | 102.729 | 95.681 |
| 2020-03-10 | 86.243 | 107.803 | 95.681 |
| 2020-03-11 | 85.608 | 102.535 | 92.447 |
| 2020-03-12 | 75.782 | 92.782 | 86.682 |
| 2020-03-13 | 76.869 | 101.399 | 86.682 |
| 2020-03-14 | 76.869 | 101.399 | 86.682 |
| 2020-03-15 | 76.869 | 101.399 | 89.059 |
| 2020-03-16 | 73.136 | 89.247 | 84.895 |
| 2020-03-17 | 74.791 | 94.598 | 86.365 |
| 2020-03-18 | 71.859 | 89.695 | 80.767 |
| 2020-03-19 | 73.95 | 90.117 | 84.295 |
| 2020-03-20 | 75.297 | 86.21 | 84.295 |
| 2020-03-21 | 75.297 | 86.21 | 84.295 |
| 2020-03-22 | 75.297 | 86.21 | 80.933 |
| 2020-03-23 | 72.057 | 83.685 | 80.243 |
| 2020-03-24 | 78.113 | 91.537 | 86.258 |
| 2020-03-25 | 80.523 | 92.592 | 86.47 |
| 2020-03-26 | 82.579 | 98.371 | 89.395 |
| 2020-03-27 | 79.886 | 95.058 | 89.395 |
| 2020-03-28 | 79.886 | 95.058 | 89.395 |
| 2020-03-29 | 79.886 | 95.058 | 88.332 |
| 2020-03-30 | 80.909 | 98.244 | 90.237 |
| 2020-03-31 | 82.24 | 96.67 | 92.645 |
| 2020-04-01 | 79.853 | 92.403 | 89.739 |
| 2020-04-02 | 80.189 | 94.513 | 89.461 |
| 2020-04-03 | 79.413 | 93.082 | 89.461 |
| 2020-04-04 | 79.413 | 93.082 | 89.461 |
| 2020-04-05 | 79.413 | 93.082 | 87.631 |
| 2020-04-06 | 82.373 | 99.629 | 92.157 |
| 2020-04-07 | 83.923 | 99.469 | 95.231 |
| 2020-04-08 | 83.938 | 102.856 | 95.231 |
| 2020-04-09 | 85.256 | 104.347 | 95.231 |
| 2020-04-10 | 85.256 | 104.347 | 95.231 |
| 2020-04-11 | 85.256 | 104.347 | 95.231 |
| 2020-04-12 | 85.256 | 104.347 | 96.752 |
| 2020-04-13 | 85.256 | 103.292 | 95.827 |
| 2020-04-14 | 85.793 | 106.45 | 95.827 |
| 2020-04-15 | 83.01 | 104.105 | 95.827 |
| 2020-04-16 | 83.488 | 104.71 | 94.322 |
| 2020-04-17 | 85.685 | 107.516 | 94.322 |
| 2020-04-18 | 85.685 | 107.516 | 94.322 |
| 2020-04-19 | 85.685 | 107.516 | 99.269 |
| 2020-04-20 | 86.258 | 105.594 | 97.941 |
| 2020-04-21 | 83.332 | 102.354 | 95.803 |
| 2020-04-22 | 84.83 | 104.702 | 95.929 |
| 2020-04-23 | 85.626 | 104.645 | 97.454 |
| 2020-04-24 | 84.688 | 106.101 | 97.454 |
| 2020-04-25 | 84.688 | 106.101 | 97.454 |
| 2020-04-26 | 84.688 | 106.101 | 100.22 |
| 2020-04-27 | 86.191 | 107.663 | 101.02 |
| 2020-04-28 | 87.643 | 107.098 | 101.02 |
| 2020-04-29 | 89.177 | 109.945 | 101.02 |
| 2020-04-30 | 87.371 | 108.932 | 102.1 |
| 2020-05-01 | 86.693 | 105.876 | 102.1 |
| 2020-05-02 | 86.693 | 105.876 | 102.1 |
| 2020-05-03 | 86.693 | 105.876 | 99.942 |
| 2020-05-04 | 84.393 | 106.326 | 98.751 |
| 2020-05-05 | 86.207 | 107.287 | 101.08 |
| 2020-05-06 | 85.909 | 106.538 | 101.19 |
| 2020-05-07 | 86.844 | 107.764 | 102.392 |
| 2020-05-08 | 87.633 | 109.582 | 102.392 |
| 2020-05-09 | 87.633 | 109.582 | 102.392 |
| 2020-05-10 | 87.633 | 109.582 | 104.12 |
| 2020-05-11 | 87.286 | 109.602 | 103.7 |
| 2020-05-12 | 87.51 | 107.35 | 103.034 |
| 2020-05-13 | 85.814 | 105.475 | 101.185 |
| 2020-05-14 | 83.948 | 106.691 | 96.555 |
| 2020-05-15 | 84.341 | 107.11 | 96.555 |
| 2020-05-16 | 84.341 | 107.11 | 96.555 |
| 2020-05-17 | 84.341 | 107.11 | 99.983 |
| 2020-05-18 | 87.772 | 110.484 | 101.783 |
| 2020-05-19 | 87.232 | 109.326 | 102.034 |
| 2020-05-20 | 88.088 | 111.146 | 102.829 |
| 2020-05-21 | 87.43 | 110.282 | 102.052 |
| 2020-05-22 | 87.407 | 110.542 | 102.052 |
| 2020-05-23 | 87.407 | 110.542 | 102.052 |
| 2020-05-24 | 87.407 | 110.542 | 103.231 |
| 2020-05-25 | 88.694 | 110.542 | 103.771 |
| 2020-05-26 | 89.655 | 111.9 | 103.425 |
| 2020-05-27 | 89.868 | 113.559 | 102.667 |
| 2020-05-28 | 91.338 | 113.32 | 102.667 |
| 2020-05-29 | 90.025 | 113.865 | 102.667 |
| 2020-05-30 | 90.025 | 113.865 | 102.667 |
| 2020-05-31 | 90.025 | 113.865 | 101.187 |
| 2020-06-01 | 91.012 | 114.292 | 101.913 |
| 2020-06-02 | 92.443 | 115.231 | 102.157 |
| 2020-06-03 | 94.794 | 116.803 | 102.087 |
| 2020-06-04 | 94.108 | 116.41 | 102.467 |
| 2020-06-05 | 96.439 | 119.461 | 102.467 |
| 2020-06-06 | 96.439 | 119.461 | 102.467 |
| 2020-06-07 | 96.439 | 119.461 | 102.467 |
| 2020-06-08 | 96.13 | 120.9 | 104.432 |
| 2020-06-09 | 94.953 | 119.957 | 104.373 |
| 2020-06-10 | 94.596 | 119.32 | 104.432 |
| 2020-06-11 | 90.722 | 112.286 | 102.249 |
| 2020-06-12 | 90.976 | 113.753 | 102.249 |
| 2020-06-13 | 90.976 | 113.753 | 102.249 |
| 2020-06-14 | 90.976 | 113.753 | 101.804 |
| 2020-06-15 | 90.727 | 114.698 | 100.871 |
| 2020-06-16 | 93.358 | 116.873 | 103.283 |
| 2020-06-17 | 94.049 | 116.453 | 102.642 |
| 2020-06-18 | 93.378 | 116.522 | 102.108 |
| 2020-06-19 | 93.905 | 115.864 | 102.108 |
| 2020-06-20 | 93.905 | 115.864 | 102.108 |
| 2020-06-21 | 93.905 | 115.864 | 100.174 |
| 2020-06-22 | 93.196 | 116.616 | 100.185 |
| 2020-06-23 | 94.404 | 117.118 | 99.804 |
| 2020-06-24 | 91.775 | 114.09 | 97.638 |
| 2020-06-25 | 92.435 | 115.341 | 97.276 |
| 2020-06-26 | 92.071 | 112.546 | 97.276 |
| 2020-06-27 | 92.071 | 112.546 | 97.276 |
| 2020-06-28 | 92.071 | 112.546 | 94.322 |
| 2020-06-29 | 92.474 | 114.199 | 95.104 |
| 2020-06-30 | 92.59 | 115.959 | 96.153 |
| 2020-07-01 | 92.808 | 116.541 | 98.814 |
| 2020-07-02 | 94.632 | 117.071 | 100.428 |
| 2020-07-03 | 93.897 | 117.071 | 100.428 |
| 2020-07-04 | 93.897 | 117.071 | 100.428 |
| 2020-07-05 | 93.897 | 117.071 | 97.4 |
| 2020-07-06 | 95.383 | 118.93 | 99.434 |
| 2020-07-07 | 94.804 | 117.643 | 98.864 |
| 2020-07-08 | 94.167 | 118.564 | 97.314 |
| 2020-07-09 | 93.437 | 117.895 | 97.077 |
| 2020-07-10 | 94.257 | 119.129 | 97.077 |
| 2020-07-11 | 94.257 | 119.129 | 97.077 |
| 2020-07-12 | 94.257 | 119.129 | 98.176 |
| 2020-07-13 | 95.2 | 118.013 | 99.083 |
| 2020-07-14 | 94.404 | 119.596 | 97.886 |
| 2020-07-15 | 96.066 | 120.682 | 100.552 |
| 2020-07-16 | 95.619 | 120.271 | 99.782 |
| 2020-07-17 | 95.768 | 120.613 | 99.782 |
| 2020-07-18 | 95.768 | 120.613 | 99.782 |
| 2020-07-19 | 95.768 | 120.613 | 99.762 |
| 2020-07-20 | 96.487 | 121.627 | 100.604 |
| 2020-07-21 | 96.791 | 121.832 | 102.096 |
| 2020-07-22 | 95.956 | 122.532 | 101.601 |
| 2020-07-23 | 96.01 | 121.022 | 100.755 |
| 2020-07-24 | 94.375 | 120.273 | 100.755 |
| 2020-07-25 | 94.375 | 120.273 | 100.755 |
| 2020-07-26 | 94.375 | 120.273 | 99.597 |
| 2020-07-27 | 94.082 | 121.162 | 99.806 |
| 2020-07-28 | 94.476 | 120.378 | 100.141 |
| 2020-07-29 | 94.416 | 121.874 | 100.208 |
| 2020-07-30 | 92.379 | 121.417 | 100.208 |
| 2020-07-31 | 91.559 | 122.348 | 100.208 |
| 2020-08-01 | 91.559 | 122.348 | 100.208 |
| 2020-08-02 | 91.559 | 122.348 | 100.353 |
| 2020-08-03 | 93.437 | 123.227 | 100.797 |
| 2020-08-04 | 93.373 | 123.672 | 101.367 |
| 2020-08-05 | 93.828 | 124.467 | 102.941 |
| 2020-08-06 | 93.142 | 125.267 | 102.668 |
| 2020-08-07 | 93.414 | 125.347 | 102.668 |
| 2020-08-08 | 93.414 | 125.347 | 102.668 |
| 2020-08-09 | 93.414 | 125.347 | 102.708 |
| 2020-08-10 | 93.697 | 125.69 | 102.611 |
| 2020-08-11 | 95.267 | 124.689 | 103.771 |
| 2020-08-12 | 96.326 | 126.434 | 104.863 |
| 2020-08-13 | 95.722 | 126.175 | 104.362 |
| 2020-08-14 | 94.576 | 126.153 | 104.362 |
| 2020-08-15 | 94.576 | 126.153 | 104.362 |
| 2020-08-16 | 94.576 | 126.153 | 105.776 |
| 2020-08-17 | 94.882 | 126.495 | 105.778 |
| 2020-08-18 | 94.347 | 126.787 | 105.223 |
| 2020-08-19 | 94.964 | 126.228 | 104.42 |
| 2020-08-20 | 93.951 | 126.627 | 102.848 |
| 2020-08-21 | 93.81 | 127.063 | 102.848 |
| 2020-08-22 | 93.81 | 127.063 | 102.848 |
| 2020-08-23 | 93.81 | 127.063 | 104.382 |
| 2020-08-24 | 95.29 | 128.339 | 104.29 |
| 2020-08-25 | 95.007 | 128.8 | 104.527 |
| 2020-08-26 | 95.873 | 130.114 | 105.507 |
| 2020-08-27 | 95.257 | 130.331 | 104.425 |
| 2020-08-28 | 94.763 | 131.209 | 104.425 |
| 2020-08-29 | 94.763 | 131.209 | 104.425 |
| 2020-08-30 | 94.763 | 131.209 | 104.252 |
| 2020-08-31 | 94.175 | 130.921 | 103.253 |
| 2020-09-01 | 93.846 | 131.906 | 103.193 |
| 2020-09-02 | 95.401 | 133.933 | 102.78 |
| 2020-09-03 | 94.064 | 129.228 | 99.324 |
| 2020-09-04 | 92.998 | 128.177 | 99.324 |
| 2020-09-05 | 92.998 | 128.177 | 99.324 |
| 2020-09-06 | 92.998 | 128.177 | 99.478 |
| 2020-09-07 | 94.55 | 128.177 | 99.773 |
| 2020-09-08 | 93.466 | 124.62 | 98.243 |
| 2020-09-09 | 94.982 | 127.13 | 98.154 |
| 2020-09-10 | 94.424 | 124.894 | 96.8 |
| 2020-09-11 | 94.548 | 124.961 | 96.8 |
| 2020-09-12 | 94.548 | 124.961 | 96.8 |
| 2020-09-13 | 94.548 | 124.961 | 97.056 |
| 2020-09-14 | 94.689 | 126.553 | 98.858 |
| 2020-09-15 | 95.318 | 127.214 | 99.174 |
| 2020-09-16 | 95.876 | 126.626 | 99.044 |
| 2020-09-17 | 95.388 | 125.561 | 98.391 |
| 2020-09-18 | 94.758 | 124.157 | 98.391 |
| 2020-09-19 | 94.758 | 124.157 | 98.391 |
| 2020-09-20 | 94.758 | 124.157 | 98.391 |
| 2020-09-21 | 91.685 | 122.72 | 97.384 |
| 2020-09-22 | 91.873 | 124.011 | 97.577 |
| 2020-09-23 | 92.381 | 121.069 | 96.041 |
| 2020-09-24 | 91.436 | 121.431 | 94.652 |
| 2020-09-25 | 91.348 | 123.371 | 94.652 |
| 2020-09-26 | 91.348 | 123.371 | 94.652 |
| 2020-09-27 | 91.348 | 123.371 | 94.652 |
| 2020-09-28 | 93.373 | 125.359 | 94.652 |
| 2020-09-29 | 92.885 | 124.755 | 96.591 |
| 2020-09-30 | 92.782 | 125.785 | 97.619 |
| 2020-10-01 | 92.965 | 126.451 | 98.351 |
| 2020-10-02 | 93.193 | 125.24 | 98.351 |
| 2020-10-03 | 93.193 | 125.24 | 98.351 |
| 2020-10-04 | 93.193 | 125.24 | 99.325 |
| 2020-10-05 | 93.949 | 127.492 | 100.456 |
| 2020-10-06 | 94.013 | 125.708 | 100.714 |
| 2020-10-07 | 93.903 | 127.896 | 100.599 |
| 2020-10-08 | 94.637 | 128.92 | 101.958 |
| 2020-10-09 | 95.162 | 130.054 | 101.958 |
| 2020-10-10 | 95.162 | 130.054 | 101.958 |
| 2020-10-11 | 95.162 | 130.054 | 102.55 |
| 2020-10-12 | 95.843 | 132.189 | 102.672 |
| 2020-10-13 | 95.318 | 131.355 | 102.053 |
| 2020-10-14 | 95.231 | 130.485 | 102.582 |
| 2020-10-15 | 93.25 | 130.286 | 101.476 |
| 2020-10-16 | 94.424 | 130.304 | 101.476 |
| 2020-10-17 | 94.424 | 130.304 | 101.476 |
| 2020-10-18 | 94.424 | 130.304 | 102.143 |
| 2020-10-19 | 94.252 | 128.176 | 102.143 |
| 2020-10-20 | 93.918 | 128.782 | 101.908 |
| 2020-10-21 | 92.705 | 128.499 | 101.605 |
| 2020-10-22 | 92.572 | 129.17 | 101.162 |
| 2020-10-23 | 93.145 | 129.615 | 101.162 |
| 2020-10-24 | 93.145 | 129.615 | 101.162 |
| 2020-10-25 | 93.145 | 129.615 | 102.422 |
| 2020-10-26 | 91.462 | 127.205 | 101.266 |
| 2020-10-27 | 90.596 | 126.82 | 100.709 |
| 2020-10-28 | 87.921 | 122.345 | 98.168 |
| 2020-10-29 | 87.815 | 123.807 | 99.687 |
| 2020-10-30 | 87.97 | 122.305 | 99.687 |
| 2020-10-31 | 87.97 | 122.305 | 99.687 |
| 2020-11-01 | 87.97 | 122.305 | 99.473 |
| 2020-11-02 | 89.383 | 123.812 | 100.816 |
| 2020-11-03 | 91.477 | 126.015 | 101.254 |
| 2020-11-04 | 93.353 | 128.794 | 102.352 |
| 2020-11-05 | 94.332 | 131.3 | 102.74 |
| 2020-11-06 | 94.147 | 131.262 | 102.74 |
| 2020-11-07 | 94.147 | 131.262 | 102.74 |
| 2020-11-08 | 94.147 | 131.262 | 103.228 |
| 2020-11-09 | 97.896 | 132.798 | 106.299 |
| 2020-11-10 | 98.777 | 132.612 | 105.625 |
| 2020-11-11 | 99.841 | 133.627 | 106.362 |
| 2020-11-12 | 98.967 | 132.293 | 105.952 |
| 2020-11-13 | 98.972 | 134.094 | 105.952 |
| 2020-11-14 | 98.972 | 134.094 | 105.952 |
| 2020-11-15 | 98.972 | 134.094 | 106.568 |
| 2020-11-16 | 100.144 | 135.656 | 107.271 |
| 2020-11-17 | 99.907 | 135.006 | 106.886 |
| 2020-11-18 | 100.349 | 133.445 | 107.827 |
| 2020-11-19 | 99.594 | 133.971 | 107.118 |
| 2020-11-20 | 100.11 | 133.061 | 107.118 |
| 2020-11-21 | 100.11 | 133.061 | 107.118 |
| 2020-11-22 | 100.11 | 133.061 | 107.523 |
| 2020-11-23 | 99.913 | 133.811 | 109.603 |
| 2020-11-24 | 100.825 | 135.974 | 110.847 |
| 2020-11-25 | 100.748 | 135.758 | 110.261 |
| 2020-11-26 | 100.63 | 135.758 | 111.629 |
| 2020-11-27 | 101.041 | 136.084 | 111.629 |
| 2020-11-28 | 101.041 | 136.084 | 111.629 |
| 2020-11-29 | 101.041 | 136.084 | 111.065 |
| 2020-11-30 | 100.046 | 135.458 | 109.784 |
| 2020-12-01 | 100.699 | 136.985 | 109.458 |
| 2020-12-02 | 100.645 | 137.231 | 107.541 |
| 2020-12-03 | 100.653 | 137.145 | 108.428 |
| 2020-12-04 | 101.249 | 138.357 | 108.428 |
| 2020-12-05 | 101.249 | 138.357 | 108.428 |
| 2020-12-06 | 101.249 | 138.357 | 110.452 |
| 2020-12-07 | 100.94 | 138.089 | 109.881 |
| 2020-12-08 | 101.146 | 138.474 | 109.583 |
| 2020-12-09 | 101.47 | 137.373 | 111.089 |
| 2020-12-10 | 101.02 | 137.197 | 110.367 |
| 2020-12-11 | 100.242 | 137.023 | 110.367 |
| 2020-12-12 | 100.242 | 137.023 | 110.367 |
| 2020-12-13 | 100.242 | 137.023 | 111.476 |
| 2020-12-14 | 100.686 | 136.426 | 112.477 |
| 2020-12-15 | 100.94 | 138.188 | 111.68 |
| 2020-12-16 | 101.773 | 138.433 | 111.245 |
| 2020-12-17 | 102.081 | 139.23 | 111.229 |
| 2020-12-18 | 101.727 | 138.742 | 111.229 |
| 2020-12-19 | 101.727 | 138.742 | 111.229 |
| 2020-12-20 | 101.727 | 138.742 | 110.241 |
| 2020-12-21 | 99.36 | 138.2 | 107.831 |
| 2020-12-22 | 100.532 | 137.913 | 109.323 |
| 2020-12-23 | 101.621 | 138.016 | 109.487 |
| 2020-12-24 | 101.747 | 138.504 | 111.01 |
| 2020-12-25 | 101.747 | 138.504 | 111.01 |
| 2020-12-26 | 101.747 | 138.504 | 111.01 |
| 2020-12-27 | 101.747 | 138.504 | 113.135 |
| 2020-12-28 | 102.415 | 139.712 | 112.893 |
| 2020-12-29 | 103.194 | 139.401 | 112.296 |
| 2020-12-30 | 102.844 | 139.588 | 113.728 |
| 2020-12-31 | 102.531 | 140.487 | 113.774 |